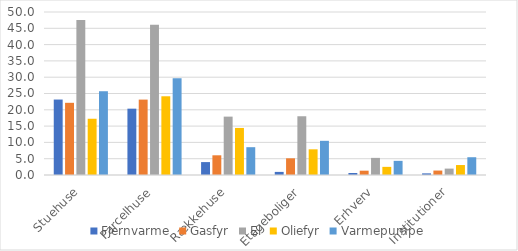
| Category | Fjernvarme | Gasfyr | El | Oliefyr | Varmepumpe |
|---|---|---|---|---|---|
| Stuehuse | 23.146 | 22.146 | 47.522 | 17.253 | 25.696 |
| Parcelhuse | 20.347 | 23.128 | 46.07 | 24.147 | 29.674 |
| Rækkehuse | 3.96 | 6.043 | 17.907 | 14.435 | 8.532 |
| Etageboliger | 0.952 | 5.12 | 18.02 | 7.878 | 10.486 |
| Erhverv | 0.607 | 1.322 | 5.25 | 2.497 | 4.338 |
| Institutioner | 0.502 | 1.365 | 1.963 | 3.057 | 5.452 |